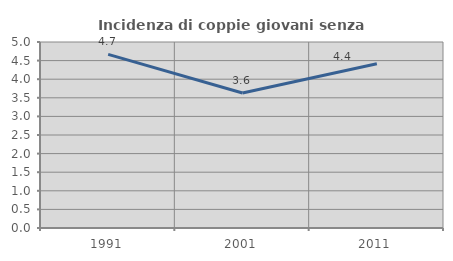
| Category | Incidenza di coppie giovani senza figli |
|---|---|
| 1991.0 | 4.667 |
| 2001.0 | 3.63 |
| 2011.0 | 4.416 |